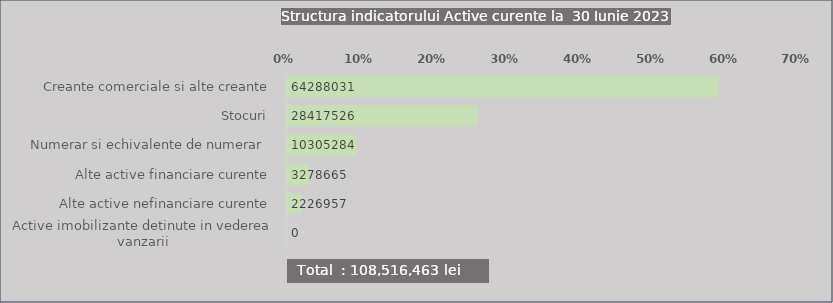
| Category | Series 0 |
|---|---|
| Creante comerciale si alte creante | 0.592 |
| Stocuri  | 0.262 |
| Numerar si echivalente de numerar  | 0.095 |
| Alte active financiare curente | 0.03 |
| Alte active nefinanciare curente | 0.021 |
| Active imobilizante detinute in vederea vanzarii | 0 |